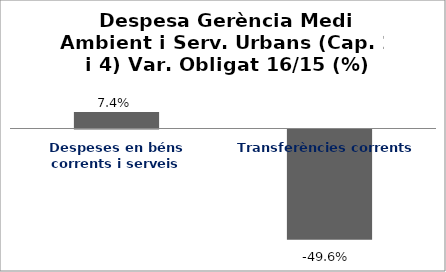
| Category | Series 0 |
|---|---|
| Despeses en béns corrents i serveis | 0.074 |
| Transferències corrents | -0.496 |